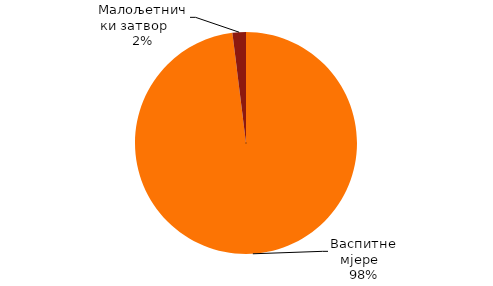
| Category | Series 0 |
|---|---|
| Васпитне мјерe   | 50 |
| Малољетнички затвор     | 1 |